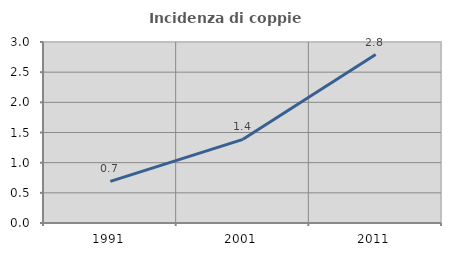
| Category | Incidenza di coppie miste |
|---|---|
| 1991.0 | 0.69 |
| 2001.0 | 1.386 |
| 2011.0 | 2.793 |